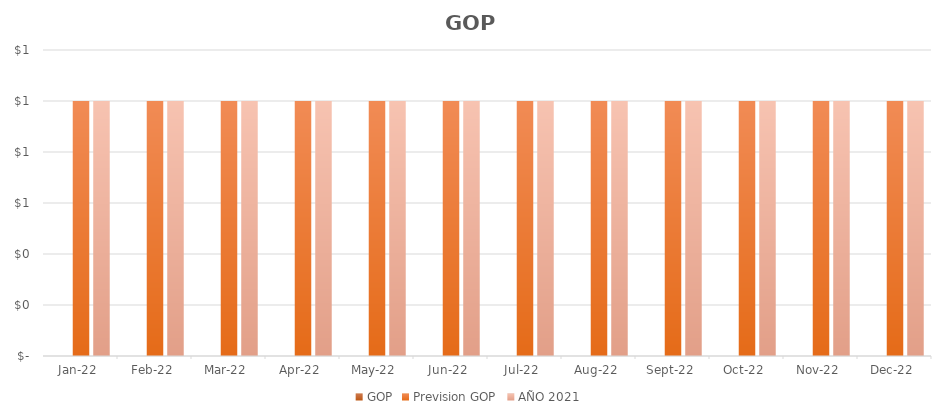
| Category |  GOP  | Prevision GOP | AÑO 2021 |
|---|---|---|---|
| 2022-01-01 | 0 | 1 | 1 |
| 2022-02-01 | 0 | 1 | 1 |
| 2022-03-01 | 0 | 1 | 1 |
| 2022-04-01 | 0 | 1 | 1 |
| 2022-05-01 | 0 | 1 | 1 |
| 2022-06-01 | 0 | 1 | 1 |
| 2022-07-01 | 0 | 1 | 1 |
| 2022-08-01 | 0 | 1 | 1 |
| 2022-09-01 | 0 | 1 | 1 |
| 2022-10-01 | 0 | 1 | 1 |
| 2022-11-01 | 0 | 1 | 1 |
| 2022-12-01 | 0 | 1 | 1 |